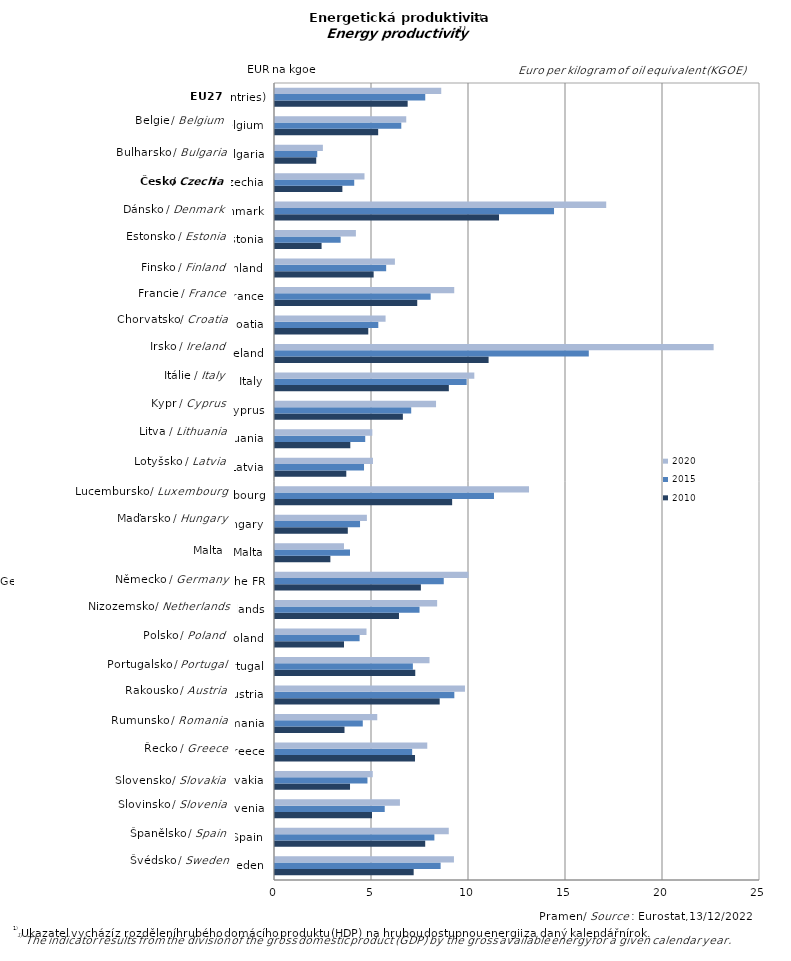
| Category | 2010 | 2015 | 2020 |
|---|---|---|---|
| Sweden | 7.148 | 8.537 | 9.224 |
| Spain | 7.743 | 8.216 | 8.957 |
| Slovenia | 5 | 5.656 | 6.44 |
| Slovakia | 3.867 | 4.766 | 5.039 |
| Greece | 7.217 | 7.07 | 7.849 |
| Romania | 3.583 | 4.525 | 5.271 |
| Austria | 8.489 | 9.244 | 9.792 |
| Portugal | 7.23 | 7.107 | 7.965 |
| Poland | 3.557 | 4.361 | 4.717 |
| Netherlands | 6.391 | 7.45 | 8.358 |
| Germany (until 1990 former territory of the FRG) | 7.52 | 8.699 | 9.975 |
| Malta | 2.854 | 3.866 | 3.556 |
| Hungary | 3.753 | 4.383 | 4.737 |
| Luxembourg | 9.131 | 11.288 | 13.094 |
| Latvia | 3.675 | 4.589 | 5.049 |
| Lithuania | 3.882 | 4.651 | 5.017 |
| Cyprus | 6.591 | 7.021 | 8.301 |
| Italy | 8.961 | 9.879 | 10.274 |
| Ireland | 11.01 | 16.175 | 22.61 |
| Croatia | 4.808 | 5.325 | 5.7 |
| France | 7.332 | 8.023 | 9.239 |
| Finland | 5.085 | 5.73 | 6.181 |
| Estonia | 2.401 | 3.383 | 4.17 |
| Denmark | 11.547 | 14.383 | 17.073 |
| Czechia | 3.473 | 4.084 | 4.613 |
| Bulgaria | 2.125 | 2.179 | 2.468 |
| Belgium | 5.318 | 6.51 | 6.765 |
| EU (27 countries) | 6.838 | 7.745 | 8.569 |